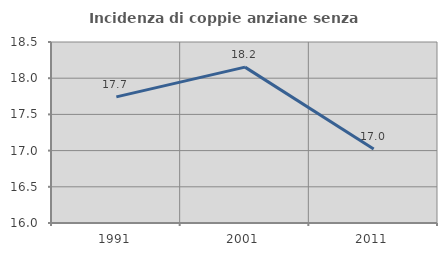
| Category | Incidenza di coppie anziane senza figli  |
|---|---|
| 1991.0 | 17.742 |
| 2001.0 | 18.153 |
| 2011.0 | 17.021 |